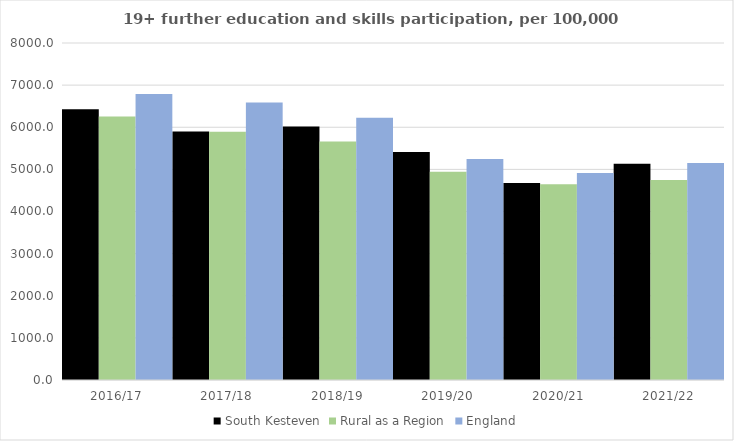
| Category | South Kesteven | Rural as a Region | England |
|---|---|---|---|
| 2016/17 | 6428 | 6253.401 | 6788 |
| 2017/18 | 5897 | 5892.029 | 6588 |
| 2018/19 | 6018 | 5661.873 | 6227 |
| 2019/20 | 5413 | 4943.801 | 5244 |
| 2020/21 | 4675 | 4646.727 | 4913 |
| 2021/22 | 5134 | 4747.049 | 5151 |